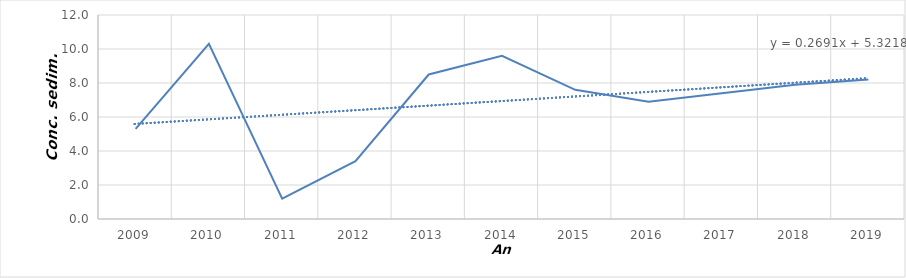
| Category | Conc. Sed. |
|---|---|
| 2009.0 | 5.3 |
| 2010.0 | 10.3 |
| 2011.0 | 1.2 |
| 2012.0 | 3.4 |
| 2013.0 | 8.5 |
| 2014.0 | 9.6 |
| 2015.0 | 7.6 |
| 2016.0 | 6.9 |
| 2017.0 | 7.4 |
| 2018.0 | 7.9 |
| 2019.0 | 8.2 |